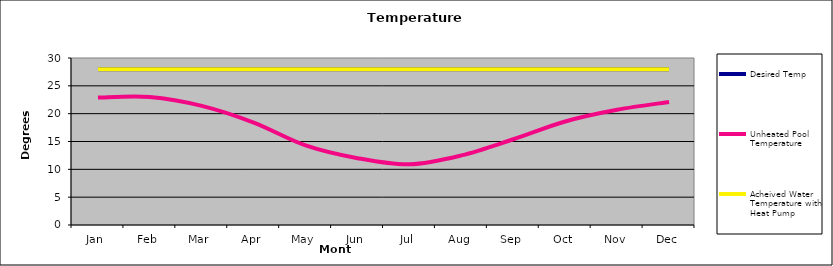
| Category | Desired Temp | Unheated Pool Temperature | Acheived Water Temperature with Heat Pump |
|---|---|---|---|
| Jan | 28 | 22.9 | 28 |
| Feb | 28 | 23 | 28 |
| Mar | 28 | 21.4 | 28 |
| Apr | 28 | 18.4 | 28 |
| May | 28 | 14.3 | 28 |
| Jun | 28 | 12 | 28 |
| Jul | 28 | 10.9 | 28 |
| Aug | 28 | 12.5 | 28 |
| Sep | 28 | 15.4 | 28 |
| Oct | 28 | 18.6 | 28 |
| Nov | 28 | 20.7 | 28 |
| Dec | 28 | 22.1 | 28 |